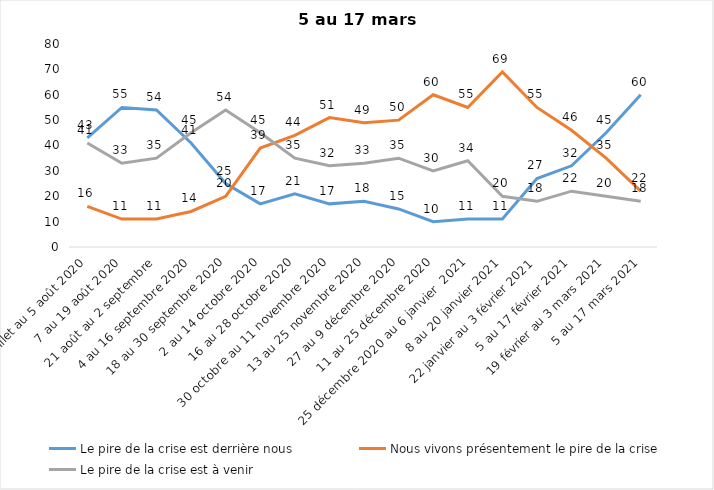
| Category | Le pire de la crise est derrière nous | Nous vivons présentement le pire de la crise | Le pire de la crise est à venir |
|---|---|---|---|
| 24 juillet au 5 août 2020 | 43 | 16 | 41 |
| 7 au 19 août 2020 | 55 | 11 | 33 |
| 21 août au 2 septembre | 54 | 11 | 35 |
| 4 au 16 septembre 2020 | 41 | 14 | 45 |
| 18 au 30 septembre 2020 | 25 | 20 | 54 |
| 2 au 14 octobre 2020 | 17 | 39 | 45 |
| 16 au 28 octobre 2020 | 21 | 44 | 35 |
| 30 octobre au 11 novembre 2020 | 17 | 51 | 32 |
| 13 au 25 novembre 2020 | 18 | 49 | 33 |
| 27 au 9 décembre 2020 | 15 | 50 | 35 |
| 11 au 25 décembre 2020 | 10 | 60 | 30 |
| 25 décembre 2020 au 6 janvier  2021 | 11 | 55 | 34 |
| 8 au 20 janvier 2021 | 11 | 69 | 20 |
| 22 janvier au 3 février 2021 | 27 | 55 | 18 |
| 5 au 17 février 2021 | 32 | 46 | 22 |
| 19 février au 3 mars 2021 | 45 | 35 | 20 |
| 5 au 17 mars 2021 | 60 | 22 | 18 |